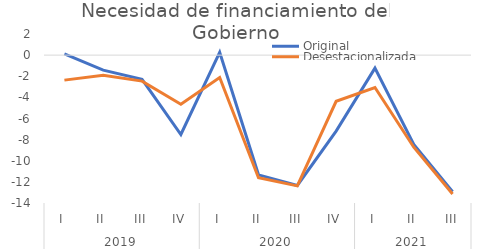
| Category | Original | Desestacionalizada |
|---|---|---|
| 0 | 0.118 | -2.366 |
| 1 | -1.418 | -1.905 |
| 2 | -2.29 | -2.461 |
| 3 | -7.515 | -4.644 |
| 4 | 0.268 | -2.116 |
| 5 | -11.332 | -11.607 |
| 6 | -12.34 | -12.378 |
| 7 | -7.195 | -4.372 |
| 8 | -1.233 | -3.067 |
| 9 | -8.451 | -8.719 |
| 10 | -12.921 | -13.15 |